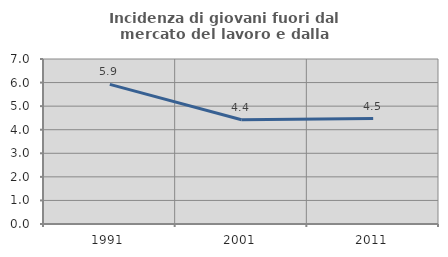
| Category | Incidenza di giovani fuori dal mercato del lavoro e dalla formazione  |
|---|---|
| 1991.0 | 5.922 |
| 2001.0 | 4.425 |
| 2011.0 | 4.474 |